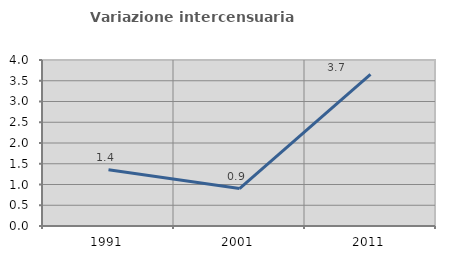
| Category | Variazione intercensuaria annua |
|---|---|
| 1991.0 | 1.356 |
| 2001.0 | 0.903 |
| 2011.0 | 3.653 |